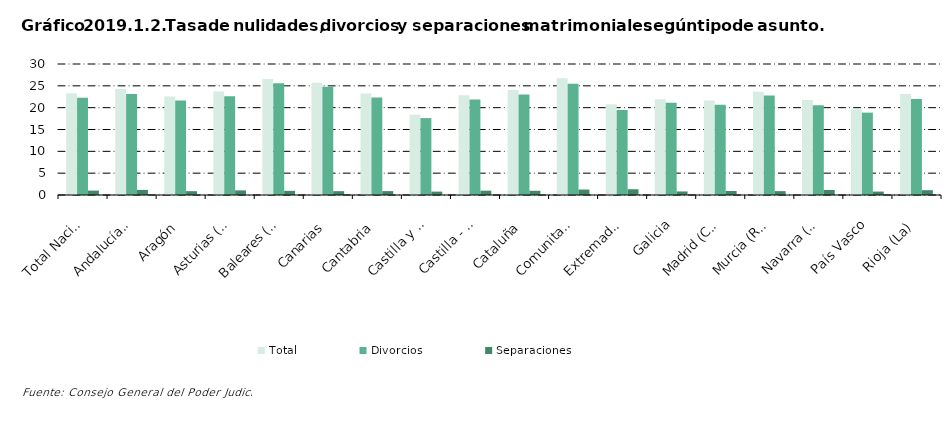
| Category | Total | Divorcios | Separaciones |
|---|---|---|---|
| Total Nacional | 23.32 | 22.295 | 1.004 |
| Andalucía(1) | 24.294 | 23.103 | 1.171 |
| Aragón | 22.535 | 21.64 | 0.879 |
| Asturias (Principado de) | 23.709 | 22.624 | 1.056 |
| Baleares (Illes) | 26.552 | 25.577 | 0.948 |
| Canarias | 25.708 | 24.803 | 0.878 |
| Cantabria | 23.267 | 22.355 | 0.895 |
| Castilla y León | 18.403 | 17.612 | 0.779 |
| Castilla - La Mancha | 22.859 | 21.856 | 0.989 |
| Cataluña | 24.038 | 23.042 | 0.964 |
| Comunitat Valenciana | 26.724 | 25.451 | 1.247 |
| Extremadura | 20.792 | 19.472 | 1.311 |
| Galicia | 21.937 | 21.115 | 0.815 |
| Madrid (Comunidad de) | 21.633 | 20.691 | 0.921 |
| Murcia (Región de) | 23.656 | 22.759 | 0.884 |
| Navarra (Comunidad Foral de) | 21.736 | 20.559 | 1.146 |
| País Vasco | 19.662 | 18.865 | 0.788 |
| Rioja (La) | 23.106 | 22.001 | 1.105 |